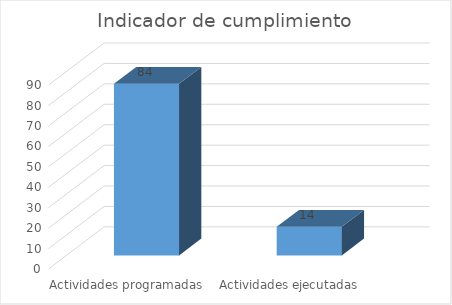
| Category | Series 0 |
|---|---|
| Actividades programadas  | 84 |
| Actividades ejecutadas  | 14 |